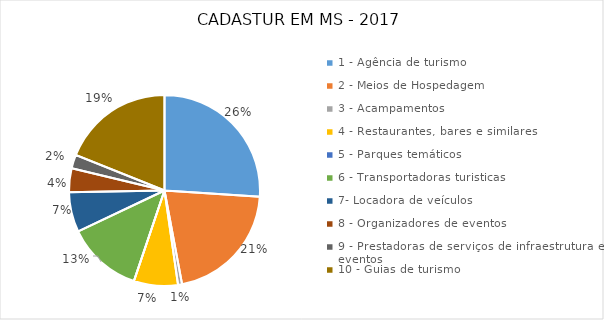
| Category | Series 0 |
|---|---|
| 1 - Agência de turismo  | 304 |
| 2 - Meios de Hospedagem  | 245 |
| 3 - Acampamentos | 8 |
| 4 - Restaurantes, bares e similares | 87 |
| 5 - Parques temáticos  | 0 |
| 6 - Transportadoras turisticas  | 149 |
| 7- Locadora de veículos | 79 |
| 8 - Organizadores de eventos | 47 |
| 9 - Prestadoras de serviços de infraestrutura e eventos  | 27 |
| 10 - Guias de turismo | 221 |